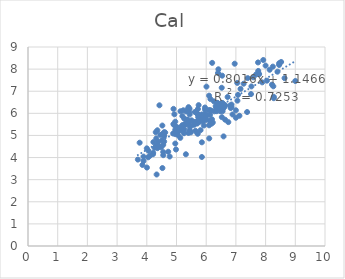
| Category | Cal |
|---|---|
| 4.301 | 5.148 |
| 5.77 | 5.615 |
| 5.939 | 5.781 |
| 6.824 | 6.241 |
| 5.569 | 5.485 |
| 6.387 | 6.465 |
| 6.276 | 6.089 |
| 5.959 | 6.173 |
| 5.0 | 5.393 |
| 6.0 | 5.707 |
| 5.201 | 5.469 |
| 5.444 | 5.952 |
| 4.319 | 4.866 |
| 6.167 | 6.121 |
| 5.638 | 5.605 |
| 6.409 | 6.189 |
| 6.502 | 6.173 |
| 6.131 | 6.143 |
| 7.377 | 6.059 |
| 7.0 | 6.137 |
| 6.854 | 6.279 |
| 6.81 | 6.358 |
| 4.357 | 5.234 |
| 4.959 | 5.623 |
| 6.523 | 6.472 |
| 5.721 | 5.944 |
| 6.357 | 6.096 |
| 4.62 | 5.132 |
| 5.699 | 5.539 |
| 6.337 | 6.253 |
| 6.553 | 6.098 |
| 6.319 | 6.327 |
| 5.836 | 5.752 |
| 5.714 | 5.075 |
| 5.893 | 5.661 |
| 4.983 | 4.365 |
| 5.757 | 5.705 |
| 5.735 | 5.819 |
| 6.129 | 5.935 |
| 6.526 | 5.829 |
| 5.959 | 5.889 |
| 4.529 | 5.061 |
| 5.735 | 5.927 |
| 6.081 | 6.147 |
| 6.638 | 6.368 |
| 6.367 | 6.476 |
| 6.398 | 6.431 |
| 7.051 | 6.573 |
| 5.292 | 5.527 |
| 6.222 | 5.585 |
| 6.602 | 6.38 |
| 4.959 | 5.258 |
| 4.921 | 5.47 |
| 6.26 | 6.541 |
| 4.936 | 5.112 |
| 5.638 | 5.213 |
| 4.959 | 5.058 |
| 4.77 | 4.047 |
| 4.509 | 4.774 |
| 4.585 | 5.148 |
| 4.114 | 4.093 |
| 4.046 | 4.011 |
| 3.699 | 3.909 |
| 4.056 | 4.309 |
| 4.886 | 5.088 |
| 4.456 | 5.025 |
| 5.854 | 4.69 |
| 5.456 | 5.168 |
| 5.481 | 5.139 |
| 5.046 | 5.166 |
| 4.523 | 5.036 |
| 4.31 | 4.528 |
| 3.759 | 4.672 |
| 4.721 | 4.263 |
| 4.553 | 4.107 |
| 3.889 | 3.845 |
| 4.004 | 3.548 |
| 4.215 | 4.213 |
| 4.357 | 4.424 |
| 3.889 | 4.044 |
| 4.553 | 4.247 |
| 4.585 | 4.721 |
| 6.013 | 5.933 |
| 5.854 | 5.95 |
| 4.928 | 5.956 |
| 5.745 | 6.371 |
| 5.26 | 5.761 |
| 6.18 | 5.534 |
| 5.444 | 5.242 |
| 6.194 | 5.731 |
| 5.62 | 6.061 |
| 4.377 | 4.715 |
| 3.854 | 3.666 |
| 4.222 | 4.699 |
| 4.553 | 4.573 |
| 5.745 | 5.634 |
| 4.377 | 4.569 |
| 4.959 | 4.634 |
| 4.481 | 4.461 |
| 4.523 | 5.447 |
| 4.208 | 4.15 |
| 5.046 | 5.02 |
| 4.26 | 4.442 |
| 6.469 | 6.101 |
| 5.921 | 5.449 |
| 6.143 | 6.646 |
| 6.854 | 6.397 |
| 6.62 | 6.303 |
| 5.959 | 6.264 |
| 5.398 | 6.23 |
| 6.495 | 6.394 |
| 5.721 | 6.195 |
| 6.456 | 6.395 |
| 6.585 | 6.24 |
| 6.409 | 6.265 |
| 5.959 | 5.962 |
| 5.387 | 5.605 |
| 5.921 | 5.796 |
| 4.357 | 4.469 |
| 4.0 | 4.416 |
| 4.585 | 4.971 |
| 5.137 | 5.349 |
| 8.638 | 7.591 |
| 6.959 | 8.245 |
| 6.538 | 7.703 |
| 6.201 | 8.282 |
| 5.456 | 5.385 |
| 5.229 | 6.138 |
| 8.276 | 6.748 |
| 7.26 | 7.34 |
| 6.721 | 6.739 |
| 5.509 | 5.683 |
| 4.331 | 3.234 |
| 7.119 | 5.891 |
| 4.526 | 3.525 |
| 5.854 | 4.026 |
| 5.252 | 5.099 |
| 4.425 | 6.363 |
| 8.215 | 7.297 |
| 8.137 | 7.97 |
| 6.585 | 4.957 |
| 8.276 | 6.685 |
| 7.509 | 6.871 |
| 7.587 | 7.629 |
| 7.752 | 7.917 |
| 6.398 | 7.823 |
| 7.398 | 7.593 |
| 7.783 | 7.773 |
| 7.77 | 7.783 |
| 8.4 | 7.884 |
| 5.102 | 5.326 |
| 6.41 | 7.992 |
| 8.523 | 8.323 |
| 8.456 | 8.188 |
| 7.071 | 6.834 |
| 8.26 | 7.223 |
| 8.0 | 8.158 |
| 7.921 | 8.411 |
| 9.0 | 7.462 |
| 8.456 | 8.266 |
| 8.046 | 7.478 |
| 7.745 | 8.302 |
| 6.523 | 7.156 |
| 7.155 | 7.107 |
| 7.886 | 7.401 |
| 7.678 | 7.757 |
| 7.523 | 7.217 |
| 8.244 | 8.112 |
| 5.69 | 6.002 |
| 5.421 | 6.066 |
| 5.595 | 5.611 |
| 5.604 | 5.49 |
| 5.371 | 5.725 |
| 5.393 | 6.19 |
| 5.106 | 5.355 |
| 5.133 | 6.094 |
| 5.366 | 5.573 |
| 5.398 | 5.521 |
| 5.197 | 5.876 |
| 6.009 | 7.208 |
| 5.15 | 5.228 |
| 5.406 | 6.28 |
| 5.326 | 6.084 |
| 4.899 | 6.202 |
| 5.742 | 5.833 |
| 6.745 | 5.602 |
| 6.886 | 5.949 |
| 6.638 | 5.712 |
| 5.174 | 5.403 |
| 4.895 | 5.513 |
| 5.81 | 5.239 |
| 6.097 | 5.459 |
| 5.265 | 5.277 |
| 5.701 | 5.111 |
| 5.402 | 5.111 |
| 5.429 | 5.627 |
| 6.097 | 6.8 |
| 5.996 | 5.86 |
| 6.553 | 6.463 |
| 6.114 | 5.673 |
| 7.046 | 7.375 |
| 5.893 | 5.635 |
| 5.284 | 5.495 |
| 5.316 | 4.149 |
| 5.128 | 4.891 |
| 6.102 | 4.865 |
| 6.143 | 5.645 |
| 5.44 | 6.208 |
| 7.0 | 5.801 |